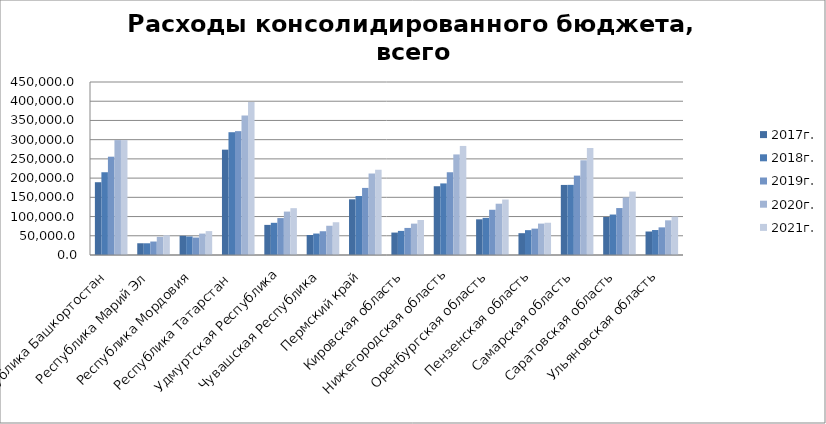
| Category | 2016г. | 2017г. | 2018г. | 2019г. | 2020г. | 2021г. |
|---|---|---|---|---|---|---|
| Республика Башкортостан |  | 189306.95 | 215269.283 | 255738.229 | 298887.957 | 299013.248 |
| Республика Марий Эл |  | 30548.218 | 30481.672 | 35048.361 | 47217.894 | 51380.437 |
| Республика Мордовия |  | 49915.428 | 48196.332 | 45410.093 | 55691.346 | 62160.947 |
| Республика Татарстан  |  | 274013.748 | 319388.456 | 322139.028 | 363185.299 | 398096.903 |
| Удмуртская Республика |  | 78316.991 | 83726.398 | 96047.319 | 112939.939 | 121804.814 |
| Чувашская Республика |  | 51997.831 | 55807.679 | 61814.275 | 76066.472 | 85185.228 |
| Пермский край |  | 144833.881 | 153371.132 | 174502.395 | 211949.439 | 221756.262 |
| Кировская область |  | 58347.696 | 62707.296 | 70411.079 | 81613.402 | 91051.033 |
| Нижегородская область |  | 178839.501 | 186203.173 | 215247.1 | 261591.222 | 283670.322 |
| Оренбургская область |  | 92813.782 | 96608.283 | 117638.666 | 133396.397 | 144285.232 |
| Пензенская область |  | 56729.808 | 64638.336 | 68608.335 | 81675.286 | 83918.07 |
| Самарская область |  | 182254.648 | 182451.585 | 206460.78 | 246385.329 | 278378.546 |
| Саратовская область |  | 98987.538 | 105241.641 | 122098.45 | 149913.109 | 164985.867 |
| Ульяновская область |  | 61135.776 | 64948.939 | 71895.23 | 90203.286 | 99841.007 |